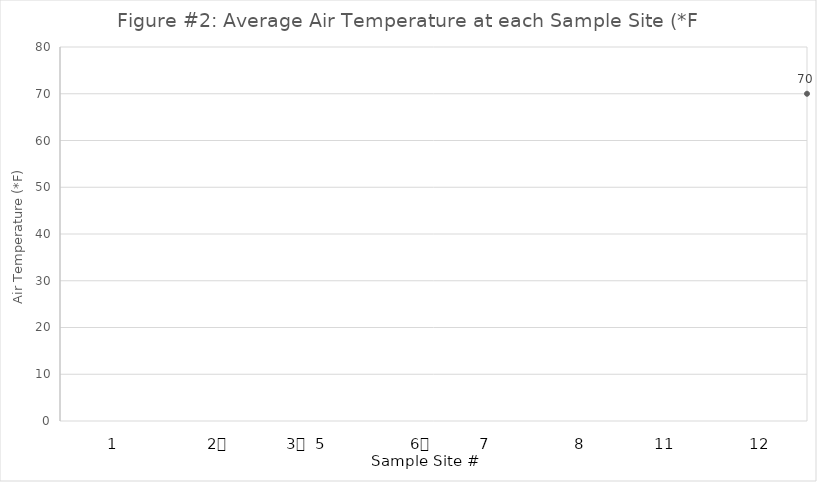
| Category | Series 0 |
|---|---|
| 0 | 70 |
| 1 | 70 |
| 2 | 63.5 |
| 3 | 58 |
| 4 | 58 |
| 5 | 63 |
| 6 | 64.5 |
| 7 | 60 |
| 8 | 61 |
| 9 | 64 |